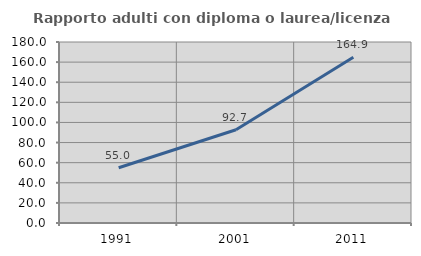
| Category | Rapporto adulti con diploma o laurea/licenza media  |
|---|---|
| 1991.0 | 54.975 |
| 2001.0 | 92.727 |
| 2011.0 | 164.923 |